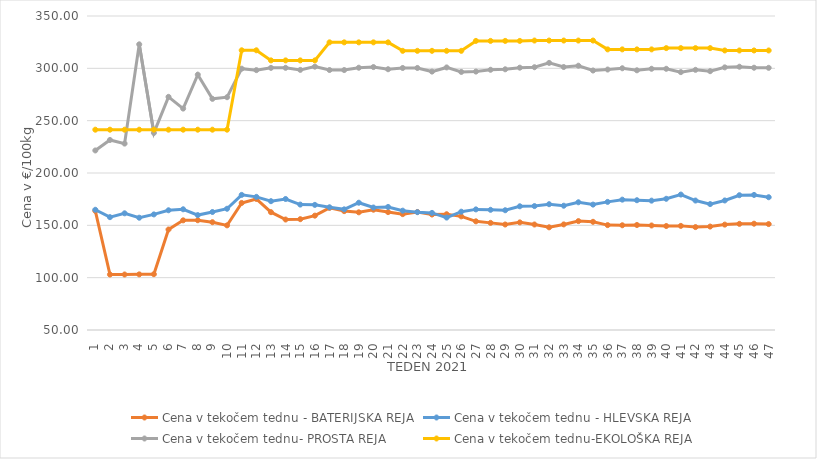
| Category | Cena v tekočem tednu - BATERIJSKA REJA | Cena v tekočem tednu - HLEVSKA REJA | Cena v tekočem tednu- PROSTA REJA | Cena v tekočem tednu-EKOLOŠKA REJA |
|---|---|---|---|---|
| 1.0 | 163.81 | 164.86 | 221.55 | 241.38 |
| 2.0 | 103.02 | 157.81 | 231.55 | 241.38 |
| 3.0 | 103.03 | 161.48 | 228.1 | 241.38 |
| 4.0 | 103.15 | 157.29 | 322.93 | 241.38 |
| 5.0 | 103.34 | 160.43 | 238.28 | 241.38 |
| 6.0 | 146.03 | 164.39 | 272.76 | 241.38 |
| 7.0 | 154.77 | 165.34 | 261.55 | 241.38 |
| 8.0 | 154.86 | 159.79 | 293.97 | 241.38 |
| 9.0 | 153 | 162.73 | 270.86 | 241.38 |
| 10.0 | 149.98 | 165.85 | 272.41 | 241.38 |
| 11.0 | 171.4 | 179.09 | 299.66 | 317.24 |
| 12.0 | 175.2 | 177.21 | 298.27 | 317.24 |
| 13.0 | 162.57 | 173.07 | 300.45 | 307.59 |
| 14.0 | 155.55 | 175.17 | 300.49 | 307.59 |
| 15.0 | 155.88 | 169.83 | 298.52 | 307.59 |
| 16.0 | 159.26 | 169.55 | 301.6 | 307.59 |
| 17.0 | 166.66 | 167.25 | 298.38 | 324.83 |
| 18.0 | 163.58 | 165.28 | 298.35 | 324.83 |
| 19.0 | 162.44 | 171.6 | 300.59 | 324.83 |
| 20.0 | 164.94 | 167.01 | 301.21 | 324.83 |
| 21.0 | 162.64 | 167.56 | 299.14 | 324.83 |
| 22.0 | 160.68 | 164.01 | 300.34 | 316.72 |
| 23.0 | 162.75 | 162.58 | 300.35 | 316.72 |
| 24.0 | 160.34 | 161.89 | 296.9 | 316.72 |
| 25.0 | 160.61 | 157.42 | 300.86 | 316.72 |
| 26.0 | 158.57 | 163.03 | 296.55 | 316.72 |
| 27.0 | 153.83 | 165.23 | 296.9 | 326.21 |
| 28.0 | 152.35 | 164.83 | 298.63 | 326.21 |
| 29.0 | 150.79 | 164.42 | 299.08 | 326.21 |
| 30.0 | 152.82 | 168.2 | 300.63 | 326.21 |
| 31.0 | 150.8 | 168.4 | 301.07 | 326.55 |
| 32.0 | 148.1 | 170.19 | 305.2 | 326.55 |
| 33.0 | 150.88 | 168.74 | 301.25 | 326.55 |
| 34.0 | 154.04 | 172.03 | 302.51 | 326.55 |
| 35.0 | 153.37 | 169.81 | 297.92 | 326.55 |
| 36.0 | 150.21 | 172.4 | 298.86 | 318.1 |
| 37.0 | 150.06 | 174.54 | 300.07 | 318.1 |
| 38.0 | 150.32 | 173.99 | 298.12 | 318.1 |
| 39.0 | 149.86 | 173.58 | 299.58 | 318.1 |
| 40.0 | 149.34 | 175.36 | 299.56 | 319.31 |
| 41.0 | 149.48 | 179.4 | 296.38 | 319.31 |
| 42.0 | 148.32 | 173.69 | 298.56 | 319.31 |
| 43.0 | 148.83 | 170.3 | 297.28 | 319.31 |
| 44.0 | 150.69 | 173.75 | 300.93 | 317.07 |
| 45.0 | 151.41 | 178.77 | 301.53 | 317.07 |
| 46.0 | 151.56 | 179.05 | 300.59 | 317.07 |
| 47.0 | 151.2 | 176.86 | 300.49 | 317.07 |